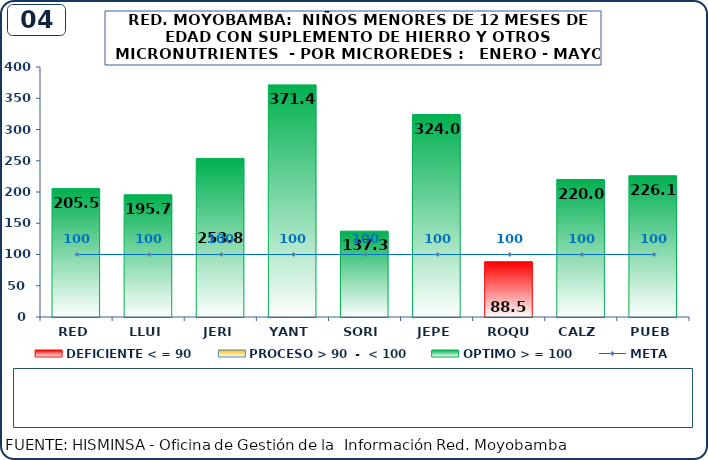
| Category | DEFICIENTE < = 90 | PROCESO > 90  -  < 100 | OPTIMO > = 100 |
|---|---|---|---|
| RED | 0 | 0 | 205.5 |
| LLUI | 0 | 0 | 195.7 |
| JERI | 0 | 0 | 253.8 |
| YANT | 0 | 0 | 371.4 |
| SORI | 0 | 0 | 137.3 |
| JEPE | 0 | 0 | 324 |
| ROQU | 88.5 | 0 | 0 |
| CALZ | 0 | 0 | 220 |
| PUEB | 0 | 0 | 226.1 |